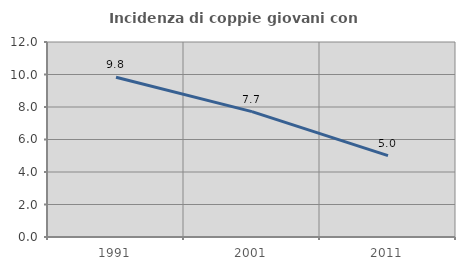
| Category | Incidenza di coppie giovani con figli |
|---|---|
| 1991.0 | 9.827 |
| 2001.0 | 7.718 |
| 2011.0 | 5.009 |